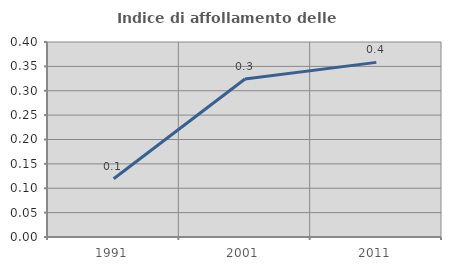
| Category | Indice di affollamento delle abitazioni  |
|---|---|
| 1991.0 | 0.12 |
| 2001.0 | 0.324 |
| 2011.0 | 0.358 |